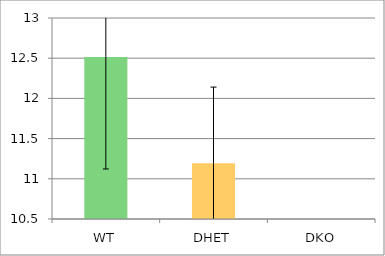
| Category | Series 0 |
|---|---|
| WT | 12.516 |
| DHET | 11.193 |
| DKO | 0 |